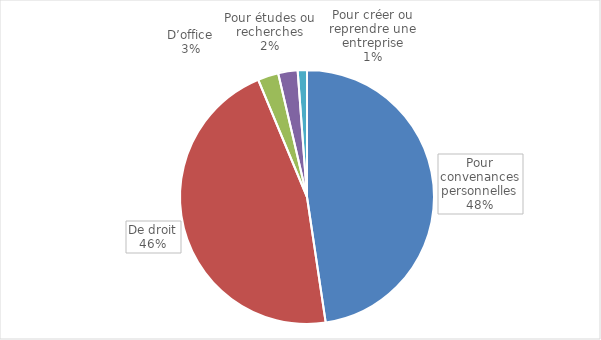
| Category | Disponibilité |
|---|---|
| Pour convenances personnelles | 18576 |
| De droit | 17966 |
| D’office | 1024 |
| Pour études ou recherches | 965 |
| Pour créer ou reprendre une entreprise | 458 |